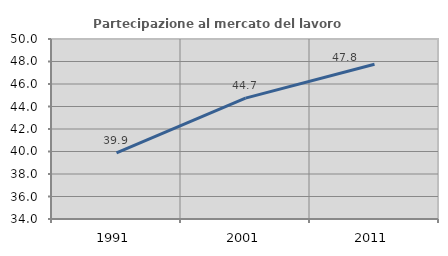
| Category | Partecipazione al mercato del lavoro  femminile |
|---|---|
| 1991.0 | 39.873 |
| 2001.0 | 44.749 |
| 2011.0 | 47.753 |